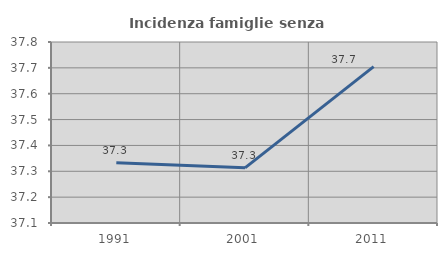
| Category | Incidenza famiglie senza nuclei |
|---|---|
| 1991.0 | 37.333 |
| 2001.0 | 37.313 |
| 2011.0 | 37.705 |